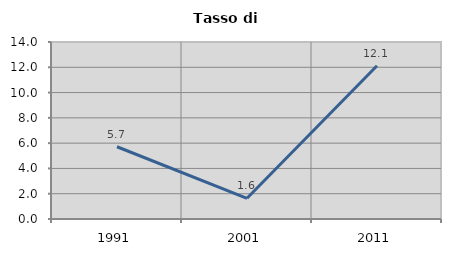
| Category | Tasso di disoccupazione   |
|---|---|
| 1991.0 | 5.714 |
| 2001.0 | 1.639 |
| 2011.0 | 12.121 |